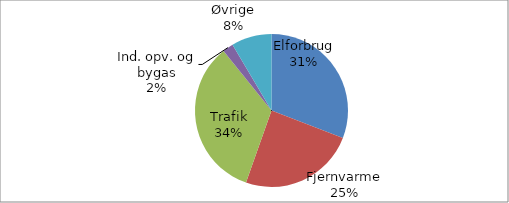
| Category | Series 0 |
|---|---|
| Elforbrug | 424996.012 |
| Fjernvarme | 337930.558 |
| Trafik | 465329.616 |
| Ind. opv. og bygas | 31451.512 |
| Øvrige | 117178.635 |